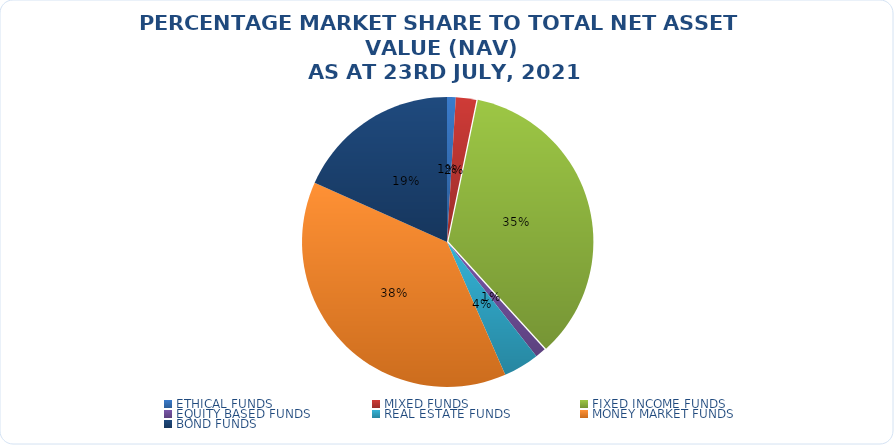
| Category | NET ASSET VALUE |
|---|---|
| ETHICAL FUNDS | 12385767292.768 |
| MIXED FUNDS | 29061287191.33 |
| FIXED INCOME FUNDS | 445875574264.781 |
| EQUITY BASED FUNDS | 15154387184.81 |
| REAL ESTATE FUNDS | 50858219353.32 |
| MONEY MARKET FUNDS | 487806910536.827 |
| BOND FUNDS | 233210190604.785 |